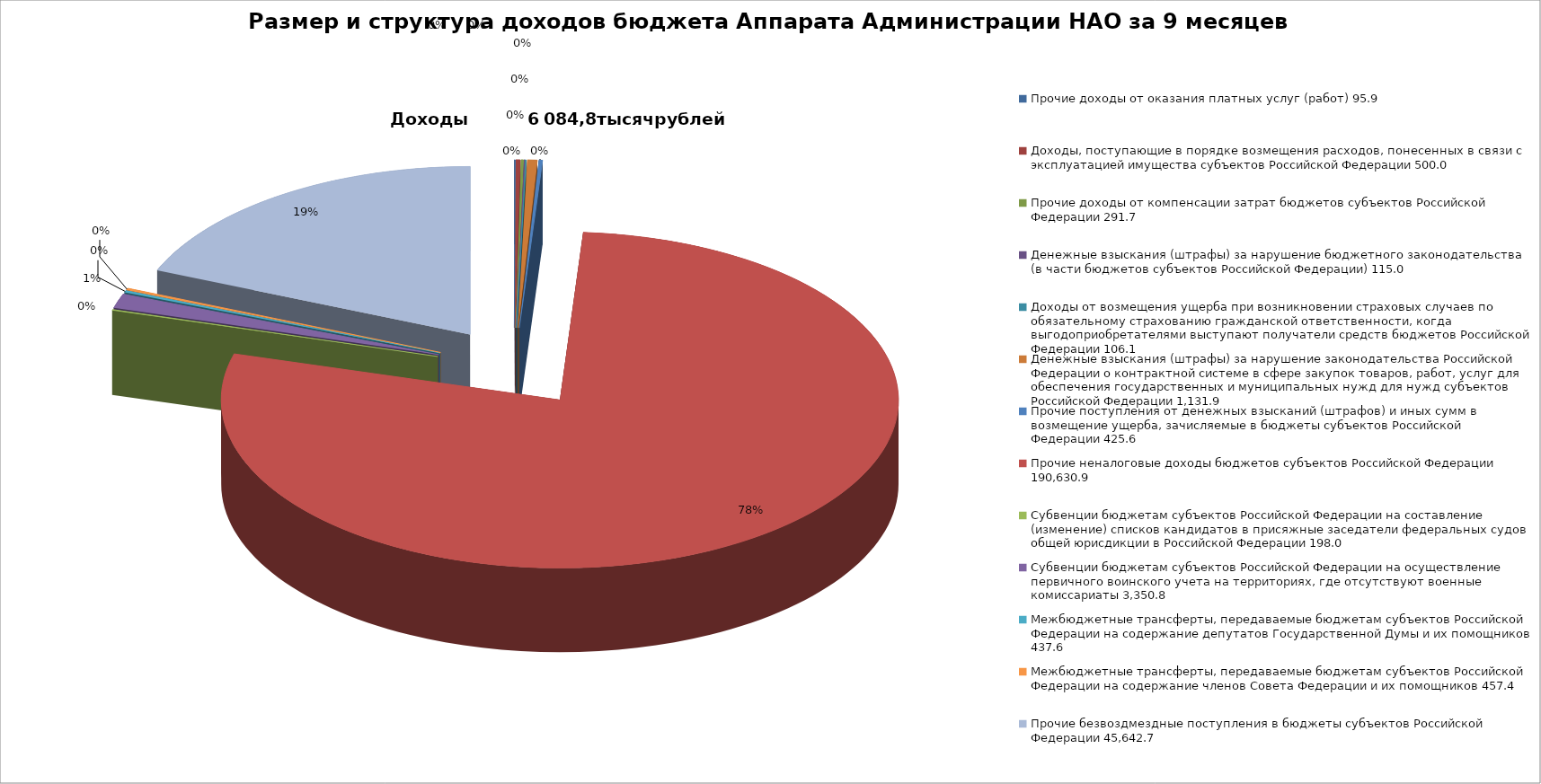
| Category | Размер и структура доходов бюджета Аппарата Администрации НАО за 9 месяцев 2016 года |
|---|---|
| 0 | 95.9 |
| 1 | 500 |
| 2 | 291.7 |
| 3 | 115 |
| 4 | 106.1 |
| 5 | 1131.9 |
| 6 | 425.6 |
| 7 | 190630.9 |
| 8 | 198 |
| 9 | 3350.8 |
| 10 | 437.6 |
| 11 | 457.4 |
| 12 | 45642.7 |